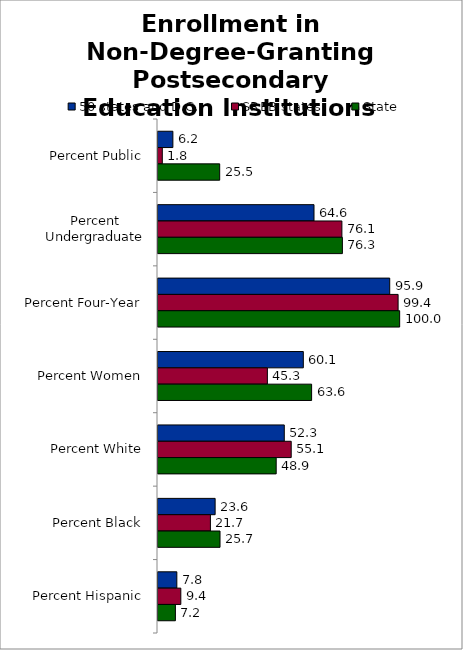
| Category | 50 states and D.C. | SREB states | State |
|---|---|---|---|
| Percent Public | 6.159 | 1.783 | 25.527 |
| Percent Undergraduate | 64.555 | 76.094 | 76.305 |
| Percent Four-Year | 95.889 | 99.351 | 100 |
| Percent Women | 60.133 | 45.26 | 63.568 |
| Percent White | 52.257 | 55.122 | 48.908 |
| Percent Black | 23.641 | 21.69 | 25.664 |
| Percent Hispanic | 7.793 | 9.443 | 7.198 |